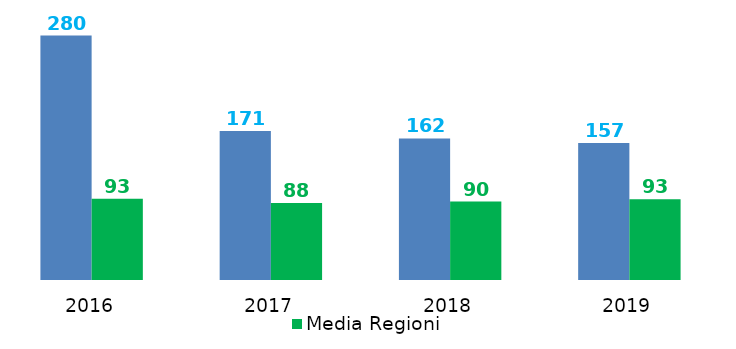
| Category | Spesa di personale procapite | Media Regioni |
|---|---|---|
| 2016.0 | 279.859 | 93.081 |
| 2017.0 | 170.583 | 88.061 |
| 2018.0 | 162.07 | 89.824 |
| 2019.0 | 157 | 92.549 |